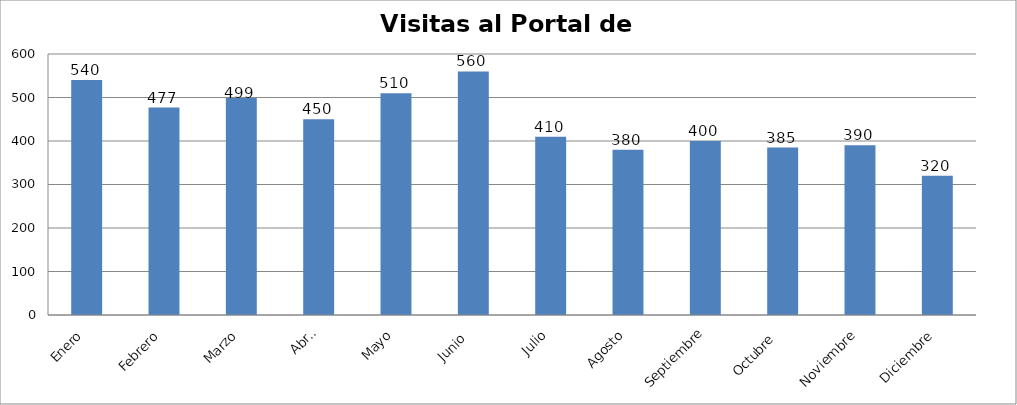
| Category | Series 0 |
|---|---|
| Enero | 540 |
| Febrero | 477 |
| Marzo | 499 |
| Abril | 450 |
| Mayo | 510 |
| Junio  | 560 |
| Julio | 410 |
| Agosto | 380 |
| Septiembre | 400 |
| Octubre  | 385 |
| Noviembre | 390 |
| Diciembre | 320 |